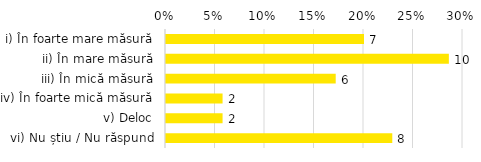
| Category | Total |
|---|---|
| i) În foarte mare măsură | 0.2 |
| ii) În mare măsură | 0.286 |
| iii) În mică măsură | 0.171 |
| iv) În foarte mică măsură | 0.057 |
| v) Deloc | 0.057 |
| vi) Nu știu / Nu răspund | 0.229 |